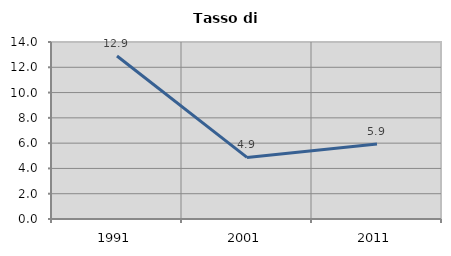
| Category | Tasso di disoccupazione   |
|---|---|
| 1991.0 | 12.893 |
| 2001.0 | 4.871 |
| 2011.0 | 5.935 |